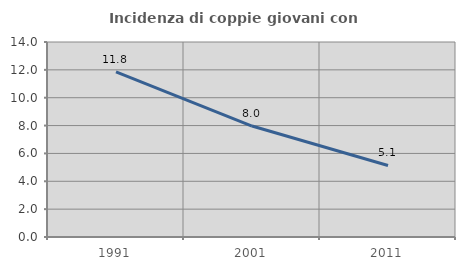
| Category | Incidenza di coppie giovani con figli |
|---|---|
| 1991.0 | 11.848 |
| 2001.0 | 7.965 |
| 2011.0 | 5.137 |